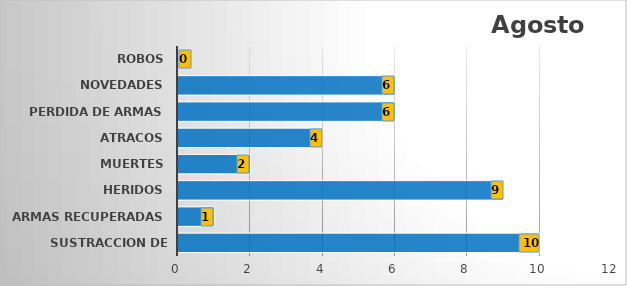
| Category | Series 1 |
|---|---|
| SUSTRACCION DE ARMAS | 10 |
| ARMAS RECUPERADAS | 1 |
| HERIDOS | 9 |
| MUERTES | 2 |
| ATRACOS | 4 |
| PERDIDA DE ARMAS | 6 |
| NOVEDADES | 6 |
| ROBOS | 0 |